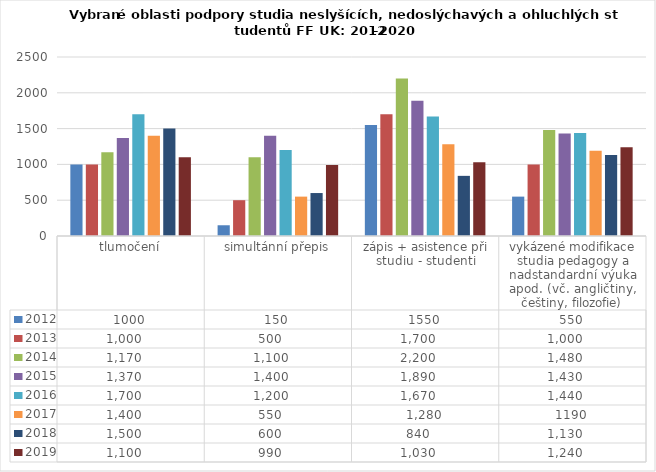
| Category | 2012 | 2013 | 2014 | 2015 | 2016 | 2017 | 2018 | 2019 |
|---|---|---|---|---|---|---|---|---|
| tlumočení | 1000 | 1000 | 1170 | 1370 | 1700 | 1400 | 1500 | 1100 |
| simultánní přepis | 150 | 500 | 1100 | 1400 | 1200 | 550 | 600 | 990 |
| zápis + asistence při studiu - studenti | 1550 | 1700 | 2200 | 1890 | 1670 | 1280 | 840 | 1030 |
| vykázené modifikace studia pedagogy a nadstandardní výuka apod. (vč. angličtiny, češtiny, filozofie) | 550 | 1000 | 1480 | 1430 | 1440 | 1190 | 1130 | 1240 |